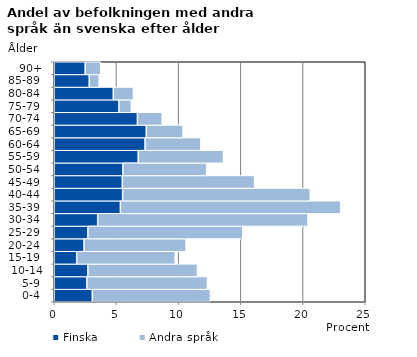
| Category | Finska | Andra språk |
|---|---|---|
|   0-4  | 3.059 | 9.496 |
|   5-9  | 2.617 | 9.697 |
| 10-14 | 2.701 | 8.808 |
| 15-19  | 1.803 | 7.92 |
| 20-24  | 2.398 | 8.198 |
| 25-29  | 2.706 | 12.458 |
| 30-34  | 3.492 | 16.907 |
| 35-39  | 5.316 | 17.703 |
| 40-44  | 5.496 | 15.086 |
| 45-49  | 5.47 | 10.634 |
| 50-54  | 5.515 | 6.736 |
| 55-59  | 6.751 | 6.853 |
| 60-64  | 7.303 | 4.486 |
| 65-69  | 7.398 | 2.959 |
| 70-74  | 6.685 | 1.995 |
| 75-79  | 5.193 | 1.005 |
| 80-84  | 4.744 | 1.623 |
| 85-89  | 2.811 | 0.803 |
| 90+ | 2.488 | 1.244 |